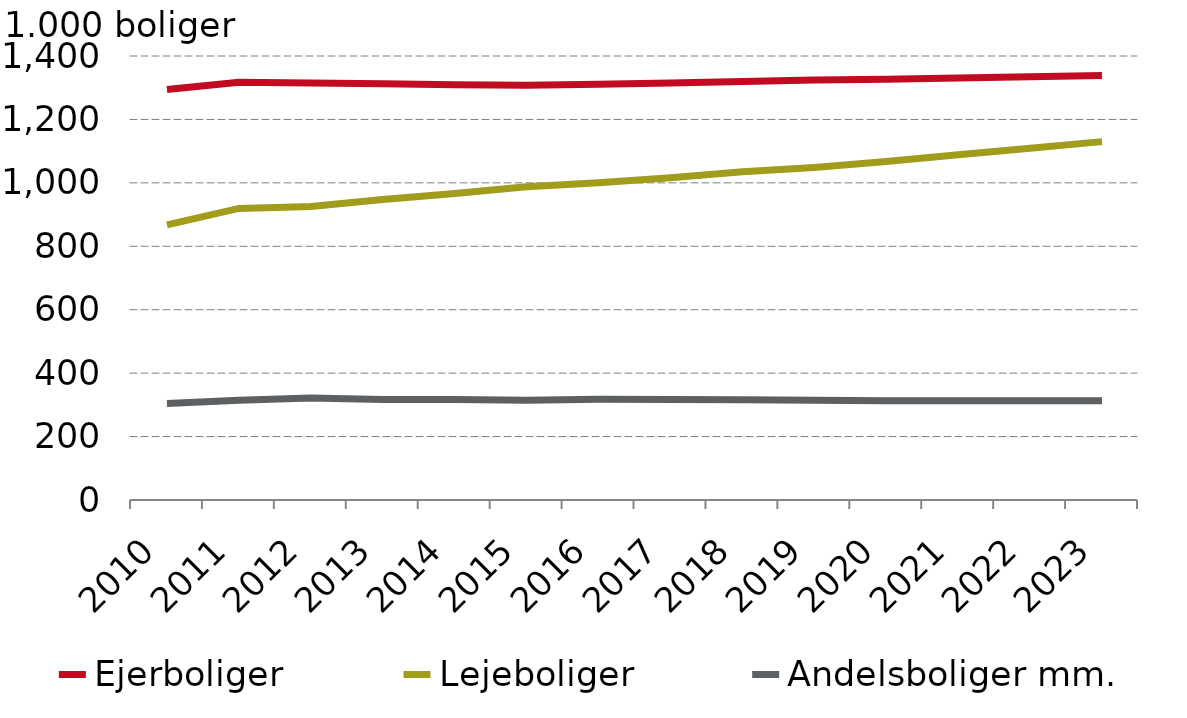
| Category |  Ejerboliger |  Lejeboliger |  Andelsboliger mm. |
|---|---|---|---|
| 2010 | 1294.564 | 867.527 | 304.391 |
| 2011 | 1317.333 | 919.383 | 314.271 |
| 2012 | 1315.252 | 925.238 | 321.387 |
| 2013 | 1312.508 | 947.747 | 316.729 |
| 2014 | 1309.409 | 966.481 | 316.526 |
| 2015 | 1308.023 | 987.392 | 314.841 |
| 2016 | 1311.101 | 1000.51 | 317.543 |
| 2017 | 1314.9 | 1015.926 | 316.817 |
| 2018 | 1319.878 | 1034.954 | 316.191 |
| 2019 | 1324.597 | 1048.717 | 314.346 |
| 2020 | 1326.304 | 1067.476 | 312.624 |
| 2021 | 1330.437 | 1088.332 | 312.624 |
| 2022 | 1334.57 | 1109.188 | 312.624 |
| 2023 | 1338.703 | 1130.044 | 312.567 |